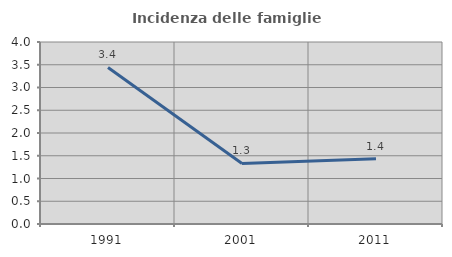
| Category | Incidenza delle famiglie numerose |
|---|---|
| 1991.0 | 3.442 |
| 2001.0 | 1.33 |
| 2011.0 | 1.433 |